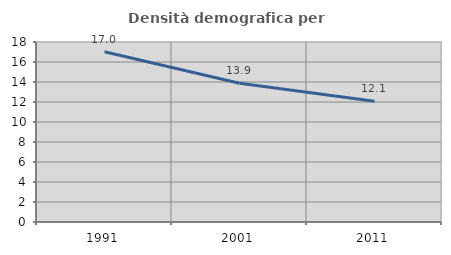
| Category | Densità demografica |
|---|---|
| 1991.0 | 17.02 |
| 2001.0 | 13.872 |
| 2011.0 | 12.085 |